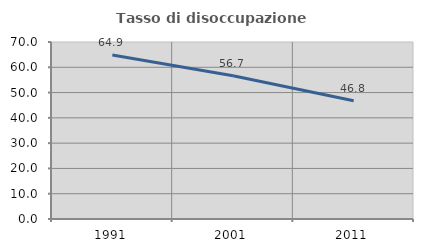
| Category | Tasso di disoccupazione giovanile  |
|---|---|
| 1991.0 | 64.889 |
| 2001.0 | 56.667 |
| 2011.0 | 46.753 |